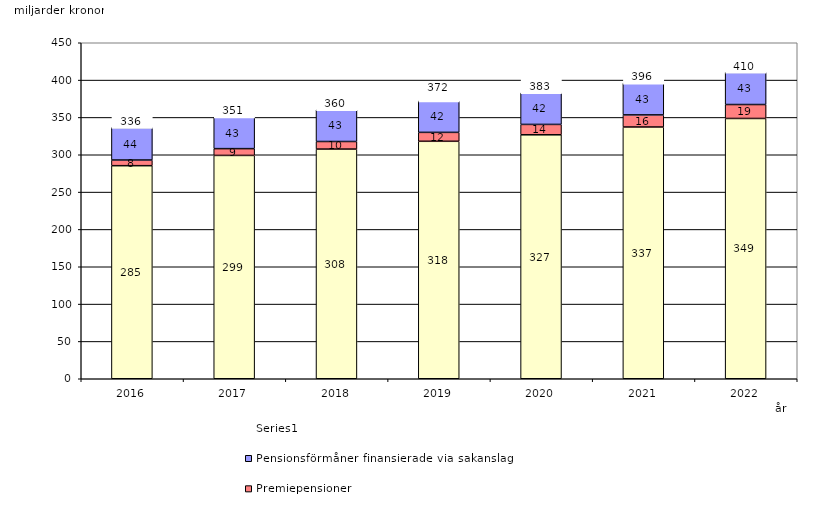
| Category | Inkomstpension och tilläggspension m.m. | Premiepensioner | Pensionsförmåner finansierade via sakanslag | Series 0 |
|---|---|---|---|---|
| 2016.0 | 285.357 | 7.598 | 43.541 | 20 |
| 2017.0 | 299.103 | 9.081 | 42.508 | 20 |
| 2018.0 | 307.609 | 10.155 | 42.514 | 20 |
| 2019.0 | 318.038 | 11.938 | 42.136 | 20 |
| 2020.0 | 326.739 | 13.899 | 42.254 | 20 |
| 2021.0 | 337.184 | 16.197 | 42.525 | 20 |
| 2022.0 | 348.604 | 18.674 | 43.123 | 20 |